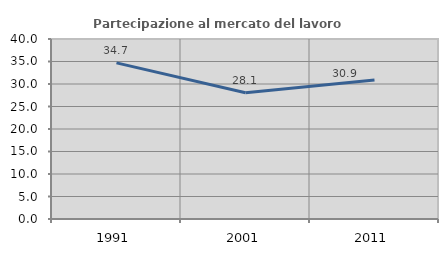
| Category | Partecipazione al mercato del lavoro  femminile |
|---|---|
| 1991.0 | 34.689 |
| 2001.0 | 28.067 |
| 2011.0 | 30.885 |